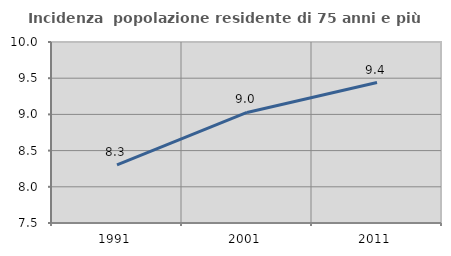
| Category | Incidenza  popolazione residente di 75 anni e più |
|---|---|
| 1991.0 | 8.303 |
| 2001.0 | 9.027 |
| 2011.0 | 9.44 |